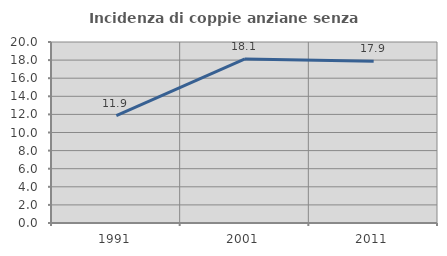
| Category | Incidenza di coppie anziane senza figli  |
|---|---|
| 1991.0 | 11.871 |
| 2001.0 | 18.123 |
| 2011.0 | 17.881 |